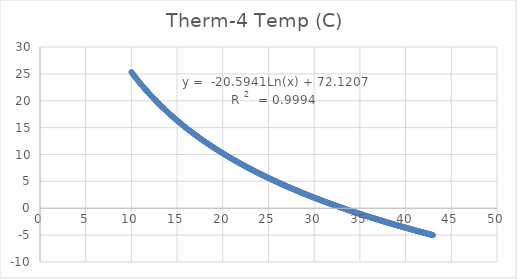
| Category | Therm-4 Temp (C)  |
|---|---|
| 10.0 | 25.336 |
| 10.05 | 25.222 |
| 10.1 | 25.109 |
| 10.15 | 24.997 |
| 10.2 | 24.885 |
| 10.25 | 24.773 |
| 10.3 | 24.663 |
| 10.35 | 24.553 |
| 10.4 | 24.443 |
| 10.45 | 24.334 |
| 10.5 | 24.226 |
| 10.55 | 24.118 |
| 10.6 | 24.011 |
| 10.65 | 23.905 |
| 10.7 | 23.799 |
| 10.75 | 23.693 |
| 10.8 | 23.588 |
| 10.85 | 23.484 |
| 10.9 | 23.38 |
| 10.95 | 23.277 |
| 11.0 | 23.174 |
| 11.05 | 23.072 |
| 11.1 | 22.97 |
| 11.15 | 22.869 |
| 11.2 | 22.768 |
| 11.25 | 22.668 |
| 11.3 | 22.569 |
| 11.35 | 22.469 |
| 11.4 | 22.371 |
| 11.45 | 22.273 |
| 11.5 | 22.175 |
| 11.55 | 22.078 |
| 11.6 | 21.981 |
| 11.65 | 21.885 |
| 11.7 | 21.789 |
| 11.75 | 21.694 |
| 11.8 | 21.599 |
| 11.85 | 21.504 |
| 11.9 | 21.411 |
| 11.95 | 21.317 |
| 12.0 | 21.224 |
| 12.05 | 21.131 |
| 12.1 | 21.039 |
| 12.15 | 20.947 |
| 12.2 | 20.856 |
| 12.25 | 20.765 |
| 12.3 | 20.675 |
| 12.35 | 20.585 |
| 12.4 | 20.495 |
| 12.45 | 20.406 |
| 12.5 | 20.317 |
| 12.55 | 20.228 |
| 12.6 | 20.14 |
| 12.65 | 20.053 |
| 12.7 | 19.965 |
| 12.75 | 19.879 |
| 12.8 | 19.792 |
| 12.85 | 19.706 |
| 12.9 | 19.62 |
| 12.95 | 19.535 |
| 13.0 | 19.45 |
| 13.05 | 19.365 |
| 13.1 | 19.281 |
| 13.15 | 19.197 |
| 13.2 | 19.114 |
| 13.25 | 19.03 |
| 13.3 | 18.948 |
| 13.35 | 18.865 |
| 13.4 | 18.783 |
| 13.45 | 18.701 |
| 13.5 | 18.62 |
| 13.55 | 18.539 |
| 13.6 | 18.458 |
| 13.65 | 18.378 |
| 13.7 | 18.298 |
| 13.75 | 18.218 |
| 13.8 | 18.138 |
| 13.85 | 18.059 |
| 13.9 | 17.981 |
| 13.95 | 17.902 |
| 14.0 | 17.824 |
| 14.05 | 17.746 |
| 14.1 | 17.669 |
| 14.15 | 17.591 |
| 14.2 | 17.515 |
| 14.25 | 17.438 |
| 14.3 | 17.362 |
| 14.35 | 17.286 |
| 14.4 | 17.21 |
| 14.45 | 17.135 |
| 14.5 | 17.06 |
| 14.55 | 16.985 |
| 14.6 | 16.91 |
| 14.65 | 16.836 |
| 14.7 | 16.762 |
| 14.75 | 16.688 |
| 14.8 | 16.615 |
| 14.85 | 16.542 |
| 14.9 | 16.469 |
| 14.95 | 16.397 |
| 15.0 | 16.324 |
| 15.05 | 16.252 |
| 15.1 | 16.181 |
| 15.15 | 16.109 |
| 15.2 | 16.038 |
| 15.25 | 15.967 |
| 15.3 | 15.896 |
| 15.35 | 15.826 |
| 15.4 | 15.756 |
| 15.45 | 15.686 |
| 15.5 | 15.616 |
| 15.55 | 15.547 |
| 15.6 | 15.478 |
| 15.65 | 15.409 |
| 15.7 | 15.34 |
| 15.75 | 15.272 |
| 15.8 | 15.204 |
| 15.85 | 15.136 |
| 15.9 | 15.068 |
| 15.95 | 15.001 |
| 16.0 | 14.934 |
| 16.05 | 14.867 |
| 16.1 | 14.8 |
| 16.15 | 14.734 |
| 16.2 | 14.667 |
| 16.25 | 14.601 |
| 16.3 | 14.536 |
| 16.35 | 14.47 |
| 16.4 | 14.405 |
| 16.45 | 14.34 |
| 16.5 | 14.275 |
| 16.55 | 14.21 |
| 16.6 | 14.146 |
| 16.65 | 14.082 |
| 16.7 | 14.018 |
| 16.75 | 13.954 |
| 16.8 | 13.89 |
| 16.85 | 13.827 |
| 16.9 | 13.764 |
| 16.95 | 13.701 |
| 17.0 | 13.638 |
| 17.05 | 13.576 |
| 17.1 | 13.513 |
| 17.15 | 13.451 |
| 17.2 | 13.389 |
| 17.25 | 13.328 |
| 17.3 | 13.266 |
| 17.35 | 13.205 |
| 17.4 | 13.144 |
| 17.45 | 13.083 |
| 17.5 | 13.022 |
| 17.55 | 12.962 |
| 17.6 | 12.901 |
| 17.65 | 12.841 |
| 17.7 | 12.781 |
| 17.75 | 12.722 |
| 17.8 | 12.662 |
| 17.85 | 12.603 |
| 17.9 | 12.544 |
| 17.95 | 12.485 |
| 18.0 | 12.426 |
| 18.05 | 12.367 |
| 18.1 | 12.309 |
| 18.15 | 12.251 |
| 18.2 | 12.193 |
| 18.25 | 12.135 |
| 18.3 | 12.077 |
| 18.35 | 12.019 |
| 18.4 | 11.962 |
| 18.45 | 11.905 |
| 18.5 | 11.848 |
| 18.55 | 11.791 |
| 18.6 | 11.734 |
| 18.65 | 11.678 |
| 18.7 | 11.622 |
| 18.75 | 11.565 |
| 18.8 | 11.51 |
| 18.85 | 11.454 |
| 18.9 | 11.398 |
| 18.95 | 11.343 |
| 19.0 | 11.287 |
| 19.05 | 11.232 |
| 19.1 | 11.177 |
| 19.15 | 11.122 |
| 19.2 | 11.068 |
| 19.25 | 11.013 |
| 19.3 | 10.959 |
| 19.35 | 10.905 |
| 19.4 | 10.851 |
| 19.45 | 10.797 |
| 19.5 | 10.743 |
| 19.55 | 10.69 |
| 19.6 | 10.636 |
| 19.65 | 10.583 |
| 19.7 | 10.53 |
| 19.75 | 10.477 |
| 19.8 | 10.424 |
| 19.85 | 10.371 |
| 19.9 | 10.319 |
| 19.95 | 10.267 |
| 20.0 | 10.214 |
| 20.05 | 10.162 |
| 20.1 | 10.11 |
| 20.15 | 10.059 |
| 20.2 | 10.007 |
| 20.25 | 9.956 |
| 20.3 | 9.904 |
| 20.35 | 9.853 |
| 20.4 | 9.802 |
| 20.45 | 9.751 |
| 20.5 | 9.7 |
| 20.55 | 9.65 |
| 20.6 | 9.599 |
| 20.65 | 9.549 |
| 20.7 | 9.499 |
| 20.75 | 9.449 |
| 20.8 | 9.399 |
| 20.85 | 9.349 |
| 20.9 | 9.299 |
| 20.95 | 9.25 |
| 21.0 | 9.2 |
| 21.05 | 9.151 |
| 21.1 | 9.102 |
| 21.15 | 9.053 |
| 21.2 | 9.004 |
| 21.25 | 8.955 |
| 21.3 | 8.907 |
| 21.35 | 8.858 |
| 21.4 | 8.81 |
| 21.45 | 8.762 |
| 21.5 | 8.714 |
| 21.55 | 8.666 |
| 21.6 | 8.618 |
| 21.65 | 8.57 |
| 21.7 | 8.523 |
| 21.75 | 8.475 |
| 21.8 | 8.428 |
| 21.85 | 8.38 |
| 21.9 | 8.333 |
| 21.95 | 8.286 |
| 22.0 | 8.239 |
| 22.05 | 8.193 |
| 22.1 | 8.146 |
| 22.15 | 8.1 |
| 22.2 | 8.053 |
| 22.25 | 8.007 |
| 22.3 | 7.961 |
| 22.35 | 7.915 |
| 22.4 | 7.869 |
| 22.45 | 7.823 |
| 22.5 | 7.777 |
| 22.55 | 7.732 |
| 22.6 | 7.686 |
| 22.65 | 7.641 |
| 22.7 | 7.596 |
| 22.75 | 7.55 |
| 22.8 | 7.505 |
| 22.85 | 7.461 |
| 22.9 | 7.416 |
| 22.95 | 7.371 |
| 23.0 | 7.327 |
| 23.05 | 7.282 |
| 23.1 | 7.238 |
| 23.15 | 7.193 |
| 23.2 | 7.149 |
| 23.25 | 7.105 |
| 23.3 | 7.061 |
| 23.35 | 7.017 |
| 23.4 | 6.974 |
| 23.45 | 6.93 |
| 23.5 | 6.887 |
| 23.55 | 6.843 |
| 23.6 | 6.8 |
| 23.65 | 6.757 |
| 23.7 | 6.714 |
| 23.75 | 6.671 |
| 23.8 | 6.628 |
| 23.85 | 6.585 |
| 23.9 | 6.542 |
| 23.95 | 6.5 |
| 24.0 | 6.457 |
| 24.05 | 6.415 |
| 24.1 | 6.373 |
| 24.15 | 6.33 |
| 24.2 | 6.288 |
| 24.25 | 6.246 |
| 24.3 | 6.204 |
| 24.35 | 6.163 |
| 24.4 | 6.121 |
| 24.45 | 6.079 |
| 24.5 | 6.038 |
| 24.55 | 5.996 |
| 24.6 | 5.955 |
| 24.65 | 5.914 |
| 24.7 | 5.873 |
| 24.75 | 5.832 |
| 24.8 | 5.791 |
| 24.85 | 5.75 |
| 24.9 | 5.709 |
| 24.95 | 5.668 |
| 25.0 | 5.628 |
| 25.05 | 5.587 |
| 25.1 | 5.547 |
| 25.15 | 5.507 |
| 25.2 | 5.466 |
| 25.25 | 5.426 |
| 25.3 | 5.386 |
| 25.35 | 5.346 |
| 25.4 | 5.306 |
| 25.45 | 5.267 |
| 25.5 | 5.227 |
| 25.55 | 5.187 |
| 25.6 | 5.148 |
| 25.65 | 5.108 |
| 25.7 | 5.069 |
| 25.75 | 5.03 |
| 25.8 | 4.991 |
| 25.85 | 4.952 |
| 25.9 | 4.913 |
| 25.95 | 4.874 |
| 26.0 | 4.835 |
| 26.05 | 4.796 |
| 26.1 | 4.757 |
| 26.15 | 4.719 |
| 26.2 | 4.68 |
| 26.25 | 4.642 |
| 26.3 | 4.604 |
| 26.35 | 4.565 |
| 26.4 | 4.527 |
| 26.45 | 4.489 |
| 26.5 | 4.451 |
| 26.55 | 4.413 |
| 26.6 | 4.375 |
| 26.65 | 4.338 |
| 26.7 | 4.3 |
| 26.75 | 4.262 |
| 26.8 | 4.225 |
| 26.85 | 4.187 |
| 26.9 | 4.15 |
| 26.95 | 4.113 |
| 27.0 | 4.076 |
| 27.05 | 4.038 |
| 27.1 | 4.001 |
| 27.15 | 3.964 |
| 27.2 | 3.927 |
| 27.25 | 3.891 |
| 27.3 | 3.854 |
| 27.35 | 3.817 |
| 27.4 | 3.781 |
| 27.45 | 3.744 |
| 27.5 | 3.708 |
| 27.55 | 3.671 |
| 27.6 | 3.635 |
| 27.65 | 3.599 |
| 27.7 | 3.563 |
| 27.75 | 3.527 |
| 27.8 | 3.491 |
| 27.85 | 3.455 |
| 27.9 | 3.419 |
| 27.95 | 3.383 |
| 28.0 | 3.347 |
| 28.05 | 3.312 |
| 28.1 | 3.276 |
| 28.15 | 3.24 |
| 28.2 | 3.205 |
| 28.25 | 3.17 |
| 28.3 | 3.134 |
| 28.35 | 3.099 |
| 28.4 | 3.064 |
| 28.45 | 3.029 |
| 28.5 | 2.994 |
| 28.55 | 2.959 |
| 28.6 | 2.924 |
| 28.65 | 2.889 |
| 28.7 | 2.855 |
| 28.75 | 2.82 |
| 28.8 | 2.785 |
| 28.85 | 2.751 |
| 28.9 | 2.716 |
| 28.95 | 2.682 |
| 29.0 | 2.648 |
| 29.05 | 2.613 |
| 29.1 | 2.579 |
| 29.15 | 2.545 |
| 29.2 | 2.511 |
| 29.25 | 2.477 |
| 29.3 | 2.443 |
| 29.35 | 2.409 |
| 29.4 | 2.375 |
| 29.45 | 2.342 |
| 29.5 | 2.308 |
| 29.55 | 2.274 |
| 29.6 | 2.241 |
| 29.65 | 2.207 |
| 29.7 | 2.174 |
| 29.75 | 2.14 |
| 29.8 | 2.107 |
| 29.85 | 2.074 |
| 29.9 | 2.041 |
| 29.95 | 2.008 |
| 30.0 | 1.975 |
| 30.05 | 1.942 |
| 30.1 | 1.909 |
| 30.15 | 1.876 |
| 30.2 | 1.843 |
| 30.25 | 1.81 |
| 30.3 | 1.778 |
| 30.35 | 1.745 |
| 30.4 | 1.712 |
| 30.45 | 1.68 |
| 30.5 | 1.647 |
| 30.55 | 1.615 |
| 30.6 | 1.583 |
| 30.65 | 1.55 |
| 30.7 | 1.518 |
| 30.75 | 1.486 |
| 30.8 | 1.454 |
| 30.85 | 1.422 |
| 30.9 | 1.39 |
| 30.95 | 1.358 |
| 31.0 | 1.326 |
| 31.05 | 1.295 |
| 31.1 | 1.263 |
| 31.15 | 1.231 |
| 31.2 | 1.199 |
| 31.25 | 1.168 |
| 31.3 | 1.136 |
| 31.35 | 1.105 |
| 31.4 | 1.074 |
| 31.45 | 1.042 |
| 31.5 | 1.011 |
| 31.55 | 0.98 |
| 31.6 | 0.949 |
| 31.65 | 0.917 |
| 31.7 | 0.886 |
| 31.75 | 0.855 |
| 31.8 | 0.824 |
| 31.85 | 0.794 |
| 31.9 | 0.763 |
| 31.95 | 0.732 |
| 32.0 | 0.701 |
| 32.05 | 0.67 |
| 32.1 | 0.64 |
| 32.15 | 0.609 |
| 32.2 | 0.579 |
| 32.25 | 0.548 |
| 32.3 | 0.518 |
| 32.35 | 0.487 |
| 32.4 | 0.457 |
| 32.45 | 0.427 |
| 32.5 | 0.397 |
| 32.55 | 0.367 |
| 32.6 | 0.336 |
| 32.65 | 0.306 |
| 32.7 | 0.276 |
| 32.75 | 0.246 |
| 32.8 | 0.217 |
| 32.85 | 0.187 |
| 32.9 | 0.157 |
| 32.95 | 0.127 |
| 33.0 | 0.098 |
| 33.05 | 0.068 |
| 33.1 | 0.038 |
| 33.15 | 0.009 |
| 33.2 | -0.021 |
| 33.25 | -0.05 |
| 33.3 | -0.08 |
| 33.35 | -0.109 |
| 33.4 | -0.138 |
| 33.45 | -0.167 |
| 33.5 | -0.197 |
| 33.55 | -0.226 |
| 33.6 | -0.255 |
| 33.65 | -0.284 |
| 33.7 | -0.313 |
| 33.75 | -0.342 |
| 33.8 | -0.371 |
| 33.85 | -0.4 |
| 33.9 | -0.428 |
| 33.95 | -0.457 |
| 34.0 | -0.486 |
| 34.05 | -0.515 |
| 34.1 | -0.543 |
| 34.15 | -0.572 |
| 34.2 | -0.6 |
| 34.25 | -0.629 |
| 34.3 | -0.657 |
| 34.35 | -0.686 |
| 34.4 | -0.714 |
| 34.45 | -0.742 |
| 34.5 | -0.77 |
| 34.55 | -0.799 |
| 34.6 | -0.827 |
| 34.65 | -0.855 |
| 34.7 | -0.883 |
| 34.75 | -0.911 |
| 34.8 | -0.939 |
| 34.85 | -0.967 |
| 34.9 | -0.995 |
| 34.95 | -1.023 |
| 35.0 | -1.05 |
| 35.05 | -1.078 |
| 35.1 | -1.106 |
| 35.15 | -1.133 |
| 35.2 | -1.161 |
| 35.25 | -1.189 |
| 35.3 | -1.216 |
| 35.35 | -1.244 |
| 35.4 | -1.271 |
| 35.45 | -1.298 |
| 35.5 | -1.326 |
| 35.55 | -1.353 |
| 35.6 | -1.38 |
| 35.65 | -1.408 |
| 35.7 | -1.435 |
| 35.75 | -1.462 |
| 35.8 | -1.489 |
| 35.85 | -1.516 |
| 35.9 | -1.543 |
| 35.95 | -1.57 |
| 36.0 | -1.597 |
| 36.05 | -1.624 |
| 36.1 | -1.651 |
| 36.15 | -1.677 |
| 36.2 | -1.704 |
| 36.25 | -1.731 |
| 36.3 | -1.758 |
| 36.35 | -1.784 |
| 36.4 | -1.811 |
| 36.45 | -1.837 |
| 36.5 | -1.864 |
| 36.55 | -1.89 |
| 36.6 | -1.917 |
| 36.65 | -1.943 |
| 36.7 | -1.97 |
| 36.75 | -1.996 |
| 36.8 | -2.022 |
| 36.85 | -2.048 |
| 36.9 | -2.075 |
| 36.95 | -2.101 |
| 37.0 | -2.127 |
| 37.05 | -2.153 |
| 37.1 | -2.179 |
| 37.15 | -2.205 |
| 37.2 | -2.231 |
| 37.25 | -2.257 |
| 37.3 | -2.283 |
| 37.35 | -2.308 |
| 37.4 | -2.334 |
| 37.45 | -2.36 |
| 37.5 | -2.386 |
| 37.55 | -2.411 |
| 37.6 | -2.437 |
| 37.65 | -2.463 |
| 37.7 | -2.488 |
| 37.75 | -2.514 |
| 37.8 | -2.539 |
| 37.85 | -2.565 |
| 37.9 | -2.59 |
| 37.95 | -2.615 |
| 38.0 | -2.641 |
| 38.05 | -2.666 |
| 38.1 | -2.691 |
| 38.15 | -2.717 |
| 38.2 | -2.742 |
| 38.25 | -2.767 |
| 38.3 | -2.792 |
| 38.35 | -2.817 |
| 38.4 | -2.842 |
| 38.45 | -2.867 |
| 38.5 | -2.892 |
| 38.55 | -2.917 |
| 38.6 | -2.942 |
| 38.65 | -2.967 |
| 38.7 | -2.992 |
| 38.75 | -3.016 |
| 38.8 | -3.041 |
| 38.85 | -3.066 |
| 38.9 | -3.091 |
| 38.95 | -3.115 |
| 39.0 | -3.14 |
| 39.05 | -3.164 |
| 39.1 | -3.189 |
| 39.15 | -3.213 |
| 39.2 | -3.238 |
| 39.25 | -3.262 |
| 39.3 | -3.287 |
| 39.35 | -3.311 |
| 39.4 | -3.335 |
| 39.45 | -3.36 |
| 39.5 | -3.384 |
| 39.55 | -3.408 |
| 39.6 | -3.432 |
| 39.65 | -3.457 |
| 39.7 | -3.481 |
| 39.75 | -3.505 |
| 39.8 | -3.529 |
| 39.85 | -3.553 |
| 39.9 | -3.577 |
| 39.95 | -3.601 |
| 40.0 | -3.625 |
| 40.05 | -3.649 |
| 40.1 | -3.672 |
| 40.15 | -3.696 |
| 40.2 | -3.72 |
| 40.25 | -3.744 |
| 40.3 | -3.768 |
| 40.35 | -3.791 |
| 40.4 | -3.815 |
| 40.45 | -3.839 |
| 40.5 | -3.862 |
| 40.55 | -3.886 |
| 40.6 | -3.909 |
| 40.65 | -3.933 |
| 40.7 | -3.956 |
| 40.75 | -3.98 |
| 40.8 | -4.003 |
| 40.85 | -4.026 |
| 40.9 | -4.05 |
| 40.95 | -4.073 |
| 41.0 | -4.096 |
| 41.05 | -4.119 |
| 41.1 | -4.143 |
| 41.15 | -4.166 |
| 41.2 | -4.189 |
| 41.25 | -4.212 |
| 41.3 | -4.235 |
| 41.35 | -4.258 |
| 41.4 | -4.281 |
| 41.45 | -4.304 |
| 41.5 | -4.327 |
| 41.55 | -4.35 |
| 41.6 | -4.373 |
| 41.65 | -4.396 |
| 41.7 | -4.419 |
| 41.75 | -4.441 |
| 41.8 | -4.464 |
| 41.85 | -4.487 |
| 41.9 | -4.51 |
| 41.95 | -4.532 |
| 42.0 | -4.555 |
| 42.05 | -4.578 |
| 42.1 | -4.6 |
| 42.15 | -4.623 |
| 42.2 | -4.645 |
| 42.25 | -4.668 |
| 42.3 | -4.69 |
| 42.35 | -4.713 |
| 42.4 | -4.735 |
| 42.45 | -4.757 |
| 42.5 | -4.78 |
| 42.55 | -4.802 |
| 42.6 | -4.824 |
| 42.65 | -4.847 |
| 42.7 | -4.869 |
| 42.75 | -4.891 |
| 42.8 | -4.913 |
| 42.85 | -4.935 |
| 42.9 | -4.958 |
| 42.95 | -4.98 |
| 43.0 | -5.002 |